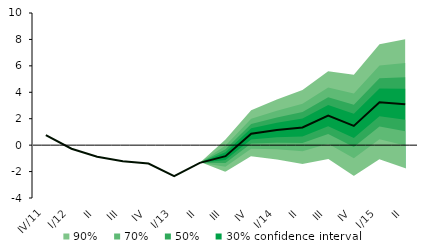
| Category | Střed předpovědi |
|---|---|
| IV/11 | 0.754 |
| I/12 | -0.273 |
| II | -0.871 |
| III | -1.222 |
| IV | -1.389 |
| I/13 | -2.343 |
| II | -1.338 |
| III | -0.832 |
| IV | 0.859 |
| I/14 | 1.143 |
| II | 1.335 |
| III | 2.232 |
| IV | 1.458 |
| I/15 | 3.241 |
| II | 3.095 |